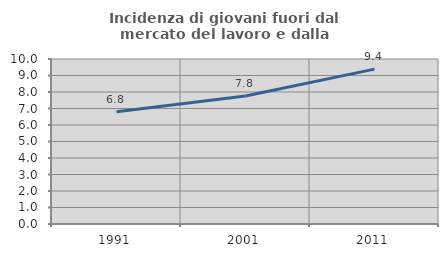
| Category | Incidenza di giovani fuori dal mercato del lavoro e dalla formazione  |
|---|---|
| 1991.0 | 6.799 |
| 2001.0 | 7.76 |
| 2011.0 | 9.385 |